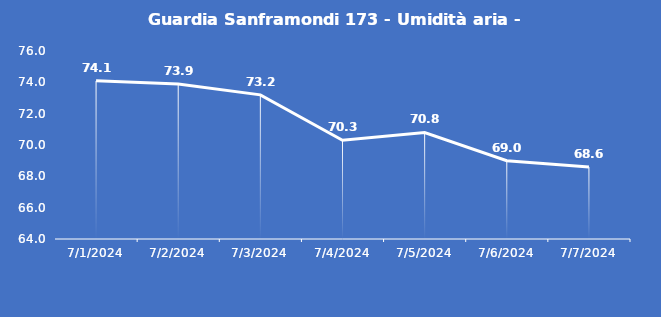
| Category | Guardia Sanframondi 173 - Umidità aria - Grezzo (%) |
|---|---|
| 7/1/24 | 74.1 |
| 7/2/24 | 73.9 |
| 7/3/24 | 73.2 |
| 7/4/24 | 70.3 |
| 7/5/24 | 70.8 |
| 7/6/24 | 69 |
| 7/7/24 | 68.6 |